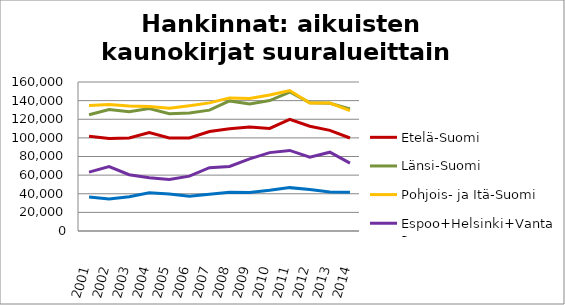
| Category | Etelä-Suomi | Länsi-Suomi | Pohjois- ja Itä-Suomi | Espoo+Helsinki+Vantaa | Muu Uusimaa |
|---|---|---|---|---|---|
| 2001.0 | 101814 | 124774 | 134792 | 63277 | 36536 |
| 2002.0 | 99344 | 130456 | 135916 | 69138 | 34345 |
| 2003.0 | 99919 | 128056 | 134152 | 60388 | 36860 |
| 2004.0 | 105591 | 131441 | 133665 | 57135 | 40954 |
| 2005.0 | 99994 | 125934 | 131713 | 55388 | 39786 |
| 2006.0 | 99892 | 126774 | 134424 | 58892 | 37414 |
| 2007.0 | 106820 | 129783 | 137556 | 67930 | 39457 |
| 2008.0 | 109820 | 139695 | 142920 | 69281 | 41589 |
| 2009.0 | 111641 | 136368 | 142357 | 77380 | 41265 |
| 2010.0 | 110154 | 140035 | 146107 | 84155 | 43664 |
| 2011.0 | 119847 | 149223 | 150830 | 86508 | 46569 |
| 2012.0 | 112447 | 137817 | 137347 | 79192 | 44513 |
| 2013.0 | 108055 | 137134 | 137475 | 84616 | 41933 |
| 2014.0 | 99841 | 131098 | 129250 | 72957 | 41488 |